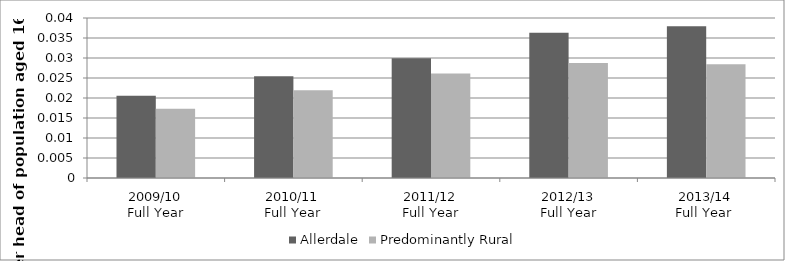
| Category | Allerdale | Predominantly Rural |
|---|---|---|
| 2009/10
Full Year | 0.021 | 0.017 |
| 2010/11
Full Year | 0.025 | 0.022 |
| 2011/12
Full Year | 0.03 | 0.026 |
| 2012/13
Full Year | 0.036 | 0.029 |
| 2013/14
Full Year  | 0.038 | 0.028 |